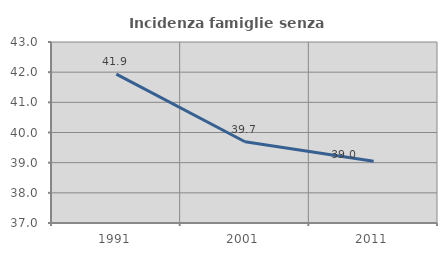
| Category | Incidenza famiglie senza nuclei |
|---|---|
| 1991.0 | 41.935 |
| 2001.0 | 39.692 |
| 2011.0 | 39.048 |